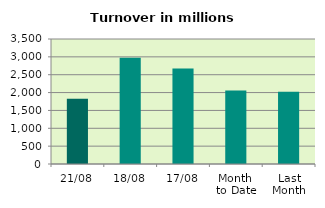
| Category | Series 0 |
|---|---|
| 21/08 | 1828.757 |
| 18/08 | 2977.267 |
| 17/08 | 2677.418 |
| Month 
to Date | 2058.356 |
| Last
Month | 2019.592 |